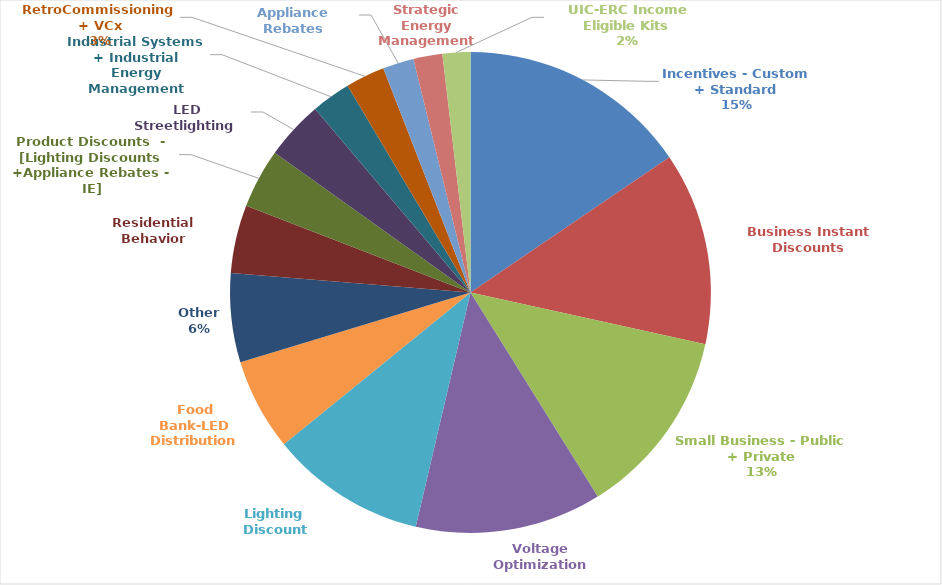
| Category | Series 0 |
|---|---|
| Incentives - Custom + Standard | 267103743.488 |
| Business Instant Discounts | 223468489.333 |
| Small Business - Public + Private | 218666038.462 |
| Voltage Optimization | 215996316.176 |
| Lighting Discount | 180736659.857 |
| Food Bank-LED Distribution | 106409645.41 |
| Other | 103106037.906 |
| Residential Behavior | 79014638.991 |
| Product Discounts  - [Lighting Discounts +Appliance Rebates - IE] | 68980233.981 |
| LED Streetlighting | 68131156.655 |
| Industrial Systems + Industrial Energy Management | 45484104.86 |
| RetroCommissioning + VCx | 45389774.091 |
| Appliance Rebates | 36042091.092 |
| Strategic Energy Management | 33582104.925 |
| UIC-ERC Income Eligible Kits | 32221357.263 |